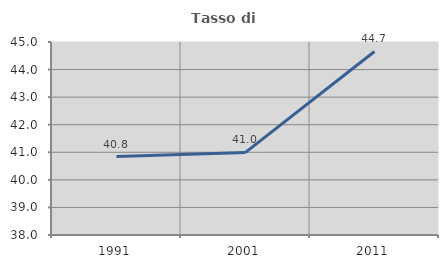
| Category | Tasso di occupazione   |
|---|---|
| 1991.0 | 40.846 |
| 2001.0 | 40.996 |
| 2011.0 | 44.657 |